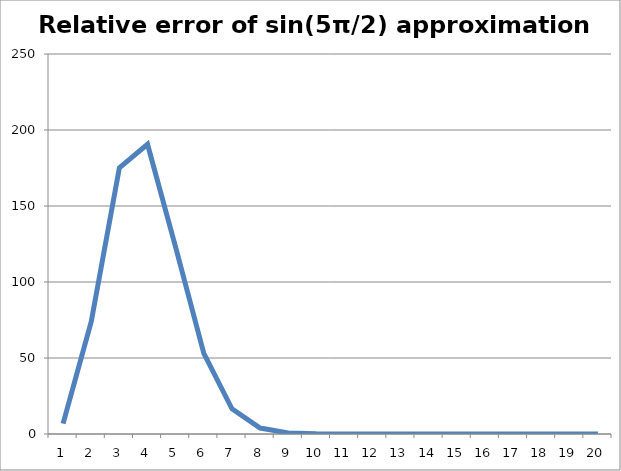
| Category | sin(5π/2) approximation |
|---|---|
| 1.0 | 6.854 |
| 2.0 | 73.892 |
| 3.0 | 175.148 |
| 4.0 | 190.614 |
| 5.0 | 122.748 |
| 6.0 | 52.977 |
| 7.0 | 16.507 |
| 8.0 | 3.903 |
| 9.0 | 0.726 |
| 10.0 | 0.109 |
| 11.0 | 0.014 |
| 12.0 | 0.001 |
| 13.0 | 0 |
| 14.0 | 0 |
| 15.0 | 0 |
| 16.0 | 0 |
| 17.0 | 0 |
| 18.0 | 0 |
| 19.0 | 0 |
| 20.0 | 0 |